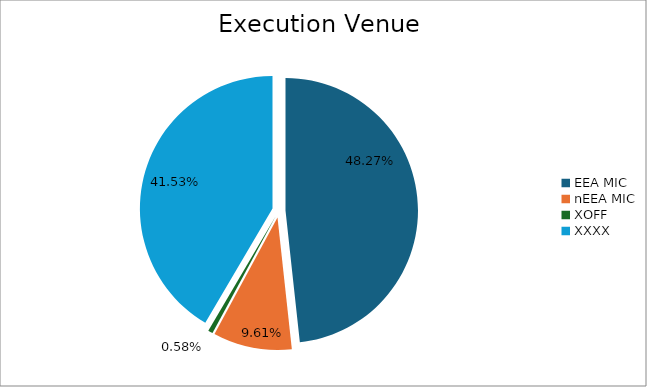
| Category | Series 0 |
|---|---|
| EEA MIC | 6979076.851 |
| nEEA MIC | 1389735.441 |
| XOFF | 84132.402 |
| XXXX | 6004476.732 |